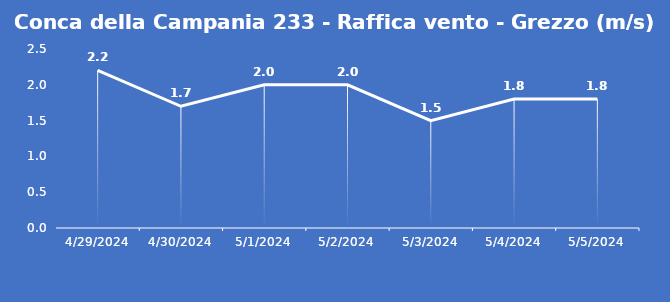
| Category | Conca della Campania 233 - Raffica vento - Grezzo (m/s) |
|---|---|
| 4/29/24 | 2.2 |
| 4/30/24 | 1.7 |
| 5/1/24 | 2 |
| 5/2/24 | 2 |
| 5/3/24 | 1.5 |
| 5/4/24 | 1.8 |
| 5/5/24 | 1.8 |